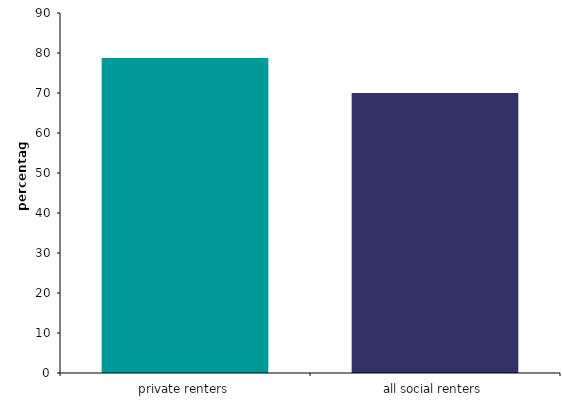
| Category | Series 0 |
|---|---|
| all social renters | 70.026 |
| private renters | 78.735 |